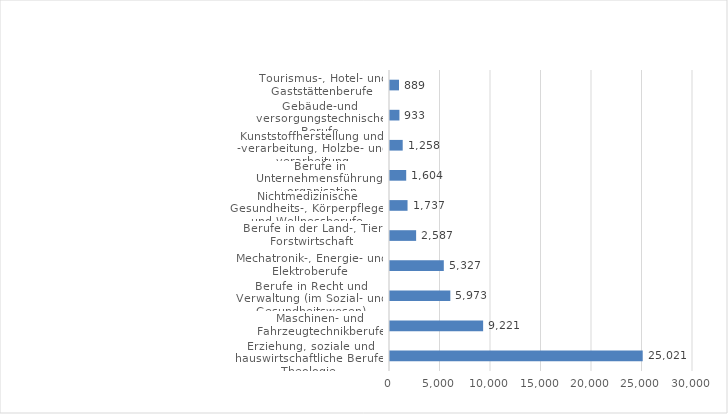
| Category | Series 0 |
|---|---|
| Erziehung, soziale und hauswirtschaftliche Berufe, Theologie | 25021 |
| Maschinen- und Fahrzeugtechnikberufe | 9221 |
| Berufe in Recht und Verwaltung (im Sozial- und Gesundheitswesen) | 5973 |
| Mechatronik-, Energie- und Elektroberufe | 5327 |
| Berufe in der Land-, Tier-, Forstwirtschaft  | 2587 |
| Nichtmedizinische Gesundheits-, Körperpflege- und Wellnessberufe, Medizintechnik | 1737 |
| Berufe in Unternehmensführung, -organisation | 1604 |
| Kunststoffherstellung und -verarbeitung, Holzbe- und -verarbeitung | 1258 |
| Gebäude-und versorgungstechnische Berufe | 933 |
| Tourismus-, Hotel- und Gaststättenberufe | 889 |